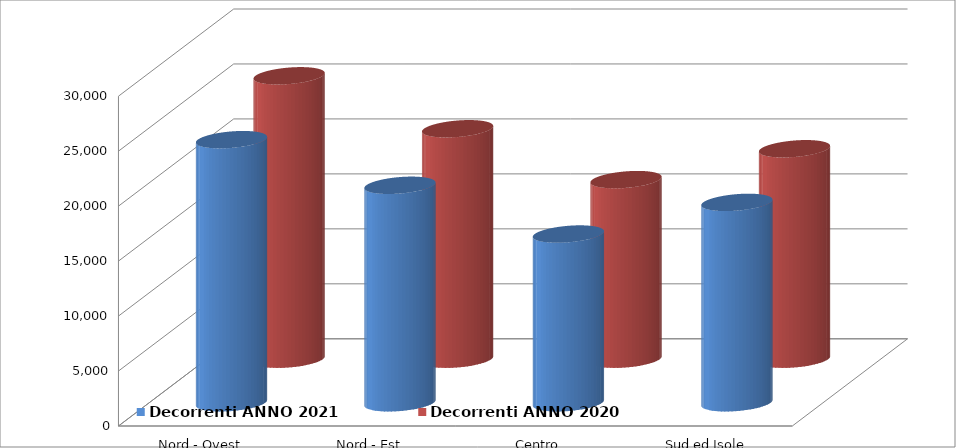
| Category | Decorrenti ANNO 2021 | Decorrenti ANNO 2020 |
|---|---|---|
| Nord - Ovest | 23936 | 25779 |
| Nord - Est | 19785 | 20962 |
| Centro | 15352 | 16336 |
| Sud ed Isole | 18230 | 19144 |